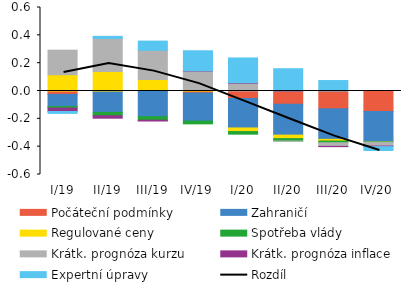
| Category | Počáteční podmínky | Zahraničí | Regulované ceny | Spotřeba vlády | Krátk. prognóza kurzu | Krátk. prognóza inflace | Expertní úpravy |
|---|---|---|---|---|---|---|---|
| I/19 | -0.024 | -0.088 | 0.117 | -0.011 | 0.177 | -0.024 | -0.014 |
| II/19 | -0.005 | -0.149 | 0.139 | -0.024 | 0.238 | -0.018 | 0.015 |
| III/19 | 0.006 | -0.185 | 0.077 | -0.025 | 0.209 | -0.006 | 0.066 |
| IV/19 | -0.014 | -0.202 | 0.009 | -0.02 | 0.135 | 0.002 | 0.144 |
| I/20 | -0.054 | -0.212 | -0.026 | -0.019 | 0.056 | 0.004 | 0.178 |
| II/20 | -0.096 | -0.221 | -0.025 | -0.017 | 0 | 0.002 | 0.159 |
| III/20 | -0.128 | -0.219 | -0.012 | -0.012 | -0.026 | -0.002 | 0.075 |
| IV/20 | -0.147 | -0.216 | -0.001 | -0.003 | -0.028 | -0.004 | -0.028 |